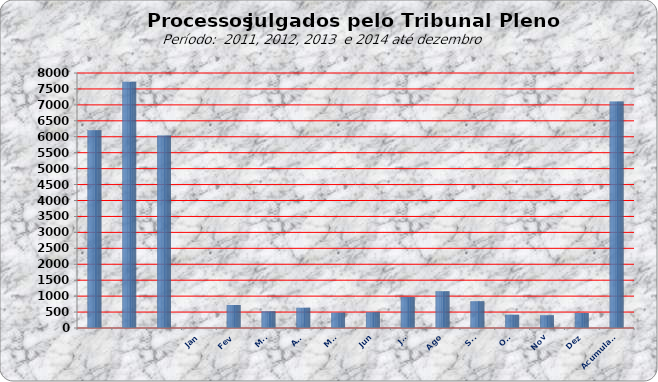
| Category | 6205 7722 6043 0 721 524 638 481 496 969 1152 842 419 398 468 |
|---|---|
|  | 6205 |
|  | 7722 |
|  | 6043 |
| Jan | 0 |
| Fev | 721 |
| Mar | 524 |
| Abr | 638 |
| Mai | 481 |
| Jun | 496 |
| Jul | 969 |
| Ago | 1152 |
| Set | 842 |
| Out | 419 |
| Nov | 398 |
| Dez | 468 |
| Acumulado | 7108 |